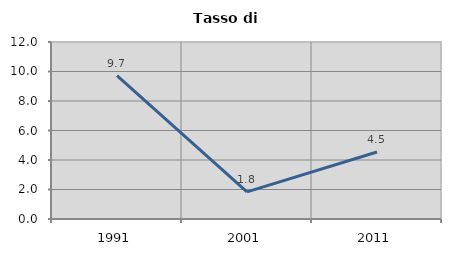
| Category | Tasso di disoccupazione   |
|---|---|
| 1991.0 | 9.722 |
| 2001.0 | 1.84 |
| 2011.0 | 4.545 |